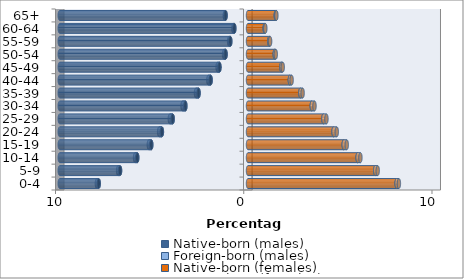
| Category | Native-born (males) | Foreign-born (males) | Native-born (females) | Foreign-born (females) |
|---|---|---|---|---|
| 0-4 | -7.931 | -0.098 | 7.895 | 0.121 |
| 5-9 | -6.798 | -0.102 | 6.758 | 0.133 |
| 10-14 | -5.883 | -0.116 | 5.822 | 0.15 |
| 15-19 | -5.139 | -0.129 | 5.084 | 0.163 |
| 20-24 | -4.574 | -0.146 | 4.545 | 0.171 |
| 25-29 | -4.002 | -0.15 | 4.006 | 0.161 |
| 30-34 | -3.327 | -0.15 | 3.388 | 0.144 |
| 35-39 | -2.628 | -0.136 | 2.783 | 0.118 |
| 40-44 | -1.986 | -0.119 | 2.223 | 0.095 |
| 45-49 | -1.517 | -0.098 | 1.774 | 0.072 |
| 50-54 | -1.192 | -0.079 | 1.421 | 0.056 |
| 55-59 | -0.94 | -0.062 | 1.132 | 0.044 |
| 60-64 | -0.727 | -0.05 | 0.887 | 0.034 |
| 65+ | -1.191 | -0.04 | 1.476 | 0.032 |